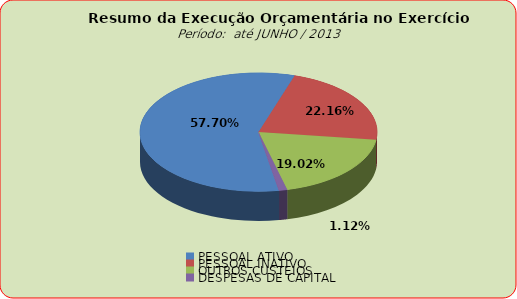
| Category | Series 0 |
|---|---|
| PESSOAL ATIVO | 46211251.85 |
| PESSOAL INATIVO | 17749474 |
| OUTROS CUSTEIOS | 15234090.88 |
| DESPESAS DE CAPITAL | 894387.28 |